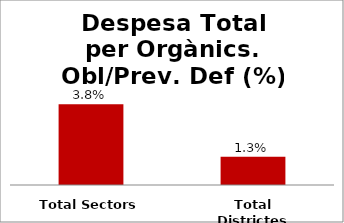
| Category | Series 0 |
|---|---|
| Total Sectors | 0.038 |
| Total Districtes | 0.013 |